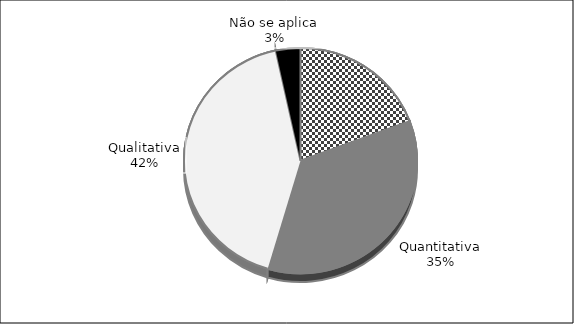
| Category | Series 0 |
|---|---|
| Quali-Quanti | 17 |
| Quantitativa | 31 |
| Qualitativa | 37 |
| Não se aplica | 3 |